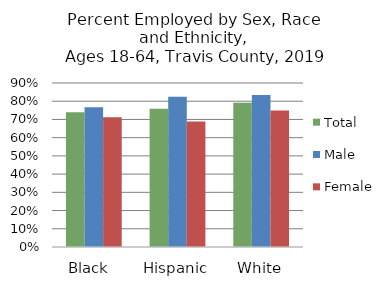
| Category | Total  | Male  | Female |
|---|---|---|---|
| Black  | 0.739 | 0.768 | 0.712 |
| Hispanic | 0.758 | 0.824 | 0.689 |
| White | 0.792 | 0.834 | 0.748 |